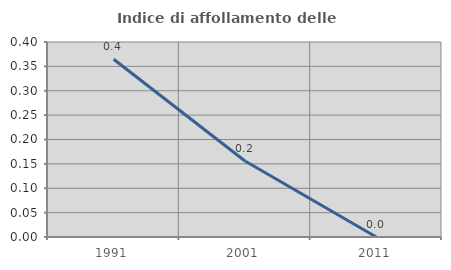
| Category | Indice di affollamento delle abitazioni  |
|---|---|
| 1991.0 | 0.365 |
| 2001.0 | 0.156 |
| 2011.0 | 0 |